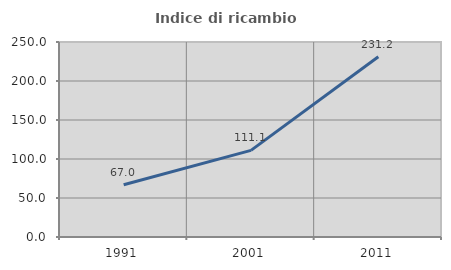
| Category | Indice di ricambio occupazionale  |
|---|---|
| 1991.0 | 67.014 |
| 2001.0 | 111.105 |
| 2011.0 | 231.151 |